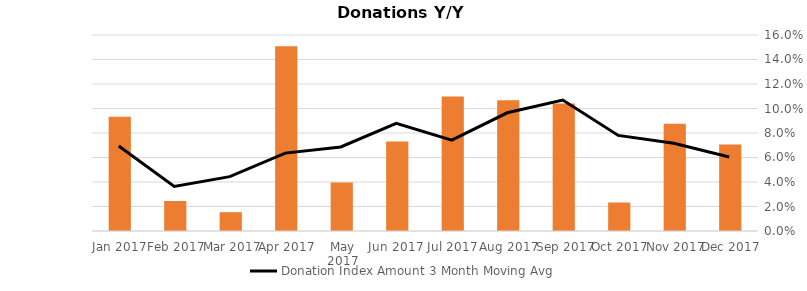
| Category | Donation Index Amount Y/Y Growth |
|---|---|
| Dec 2017 | 0.071 |
| Nov 2017 | 0.087 |
| Oct 2017 | 0.023 |
| Sep 2017 | 0.104 |
| Aug 2017 | 0.107 |
| Jul 2017 | 0.11 |
| Jun 2017 | 0.073 |
| May 2017 | 0.04 |
| Apr 2017 | 0.151 |
| Mar 2017 | 0.015 |
| Feb 2017 | 0.024 |
| Jan 2017 | 0.093 |